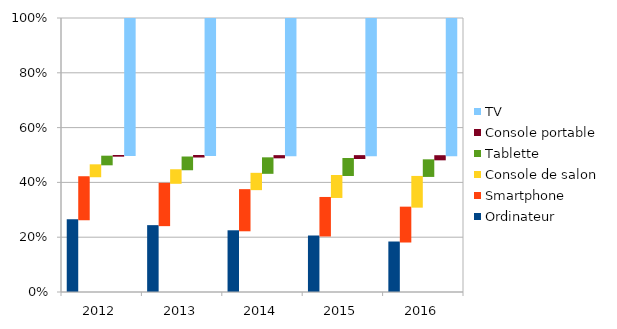
| Category | Ordinateur | Smartphone | Console de salon | Tablette | Console portable | TV |
|---|---|---|---|---|---|---|
| 2012.0 | 53.1 | 31.4 | 8.7 | 6.3 | 0.5 | 100 |
| 2013.0 | 48.8 | 30.9 | 9.9 | 9.3 | 1.1 | 100 |
| 2014.0 | 45 | 30 | 11.9 | 11.3 | 1.6 | 100 |
| 2015.0 | 41.2 | 28.1 | 16 | 12.4 | 2.1 | 100 |
| 2016.0 | 36.8 | 25.4 | 22.4 | 12.1 | 3 | 100 |